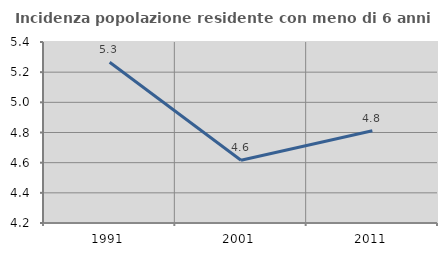
| Category | Incidenza popolazione residente con meno di 6 anni |
|---|---|
| 1991.0 | 5.265 |
| 2001.0 | 4.616 |
| 2011.0 | 4.811 |